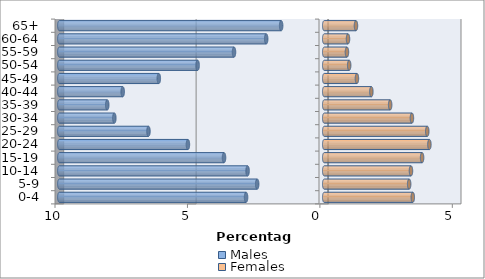
| Category | Males | Females |
|---|---|---|
| 0-4 | -2.95 | 3.344 |
| 5-9 | -2.531 | 3.206 |
| 10-14 | -2.893 | 3.275 |
| 15-19 | -3.783 | 3.695 |
| 20-24 | -5.146 | 3.971 |
| 25-29 | -6.635 | 3.89 |
| 30-34 | -7.924 | 3.311 |
| 35-39 | -8.192 | 2.489 |
| 40-44 | -7.608 | 1.78 |
| 45-49 | -6.244 | 1.235 |
| 50-54 | -4.779 | 0.942 |
| 55-59 | -3.406 | 0.858 |
| 60-64 | -2.191 | 0.898 |
| 65+ | -1.626 | 1.199 |